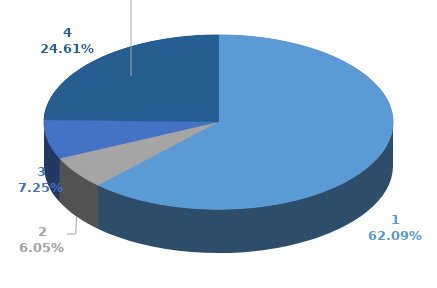
| Category | Series 0 | Series 1 |
|---|---|---|
| 0 | 1392608 |  |
| 1 | 135710 |  |
| 2 | 162500 |  |
| 3 | 551963 |  |